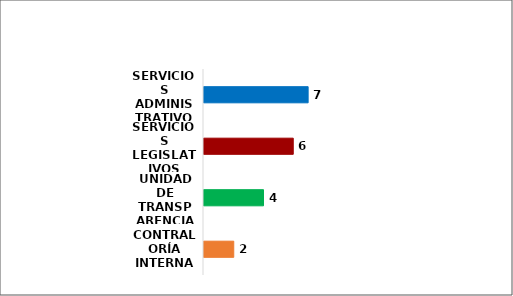
| Category | Series 0 |
|---|---|
| CONTRALORÍA INTERNA | 2 |
| UNIDAD DE TRANSPARENCIA | 4 |
| SERVICIOS LEGISLATIVOS | 6 |
| SERVICIOS ADMINISTRATIVOS | 7 |